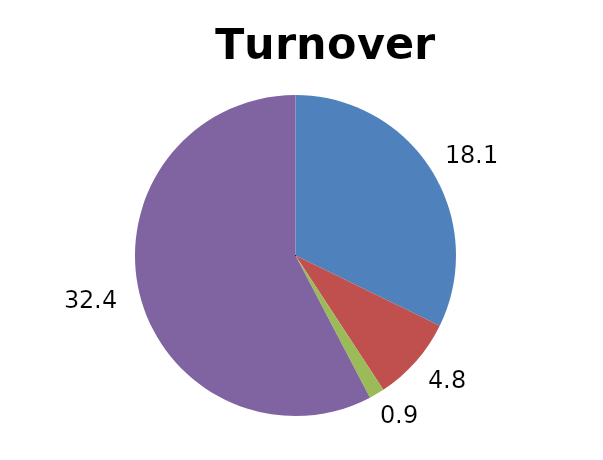
| Category | Series 0 |
|---|---|
| Medical Technology | 18.087 |
| Medical Biotechnology | 4.804 |
| Industrial Biotechnology | 0.864 |
| Pharmaceutical | 32.377 |